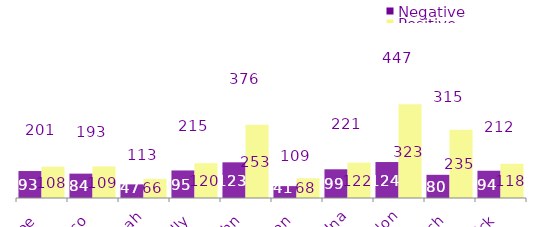
| Category | Negative | Positive |
|---|---|---|
| Joe | 93 | 108 |
| Marco | 84 | 109 |
| Noah | 47 | 66 |
| Kelly | 95 | 120 |
| John | 123 | 253 |
| Ken | 41 | 68 |
| Una | 99 | 122 |
| Gordon | 124 | 323 |
| Mich | 80 | 235 |
| Patrick | 94 | 118 |